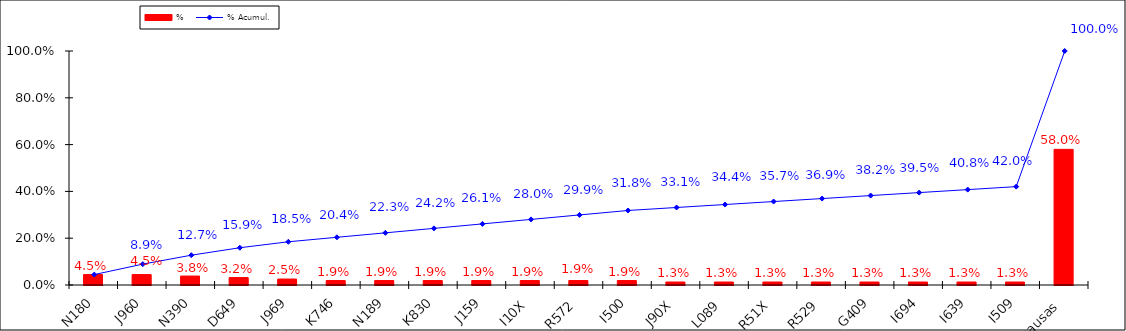
| Category | % |
|---|---|
| N180 | 0.045 |
| J960 | 0.045 |
| N390 | 0.038 |
| D649 | 0.032 |
| J969 | 0.025 |
| K746 | 0.019 |
| N189 | 0.019 |
| K830 | 0.019 |
| J159 | 0.019 |
| I10X | 0.019 |
| R572 | 0.019 |
| I500 | 0.019 |
| J90X | 0.013 |
| L089 | 0.013 |
| R51X | 0.013 |
| R529 | 0.013 |
| G409 | 0.013 |
| I694 | 0.013 |
| I639 | 0.013 |
| I509 | 0.013 |
| Otras causas | 0.58 |